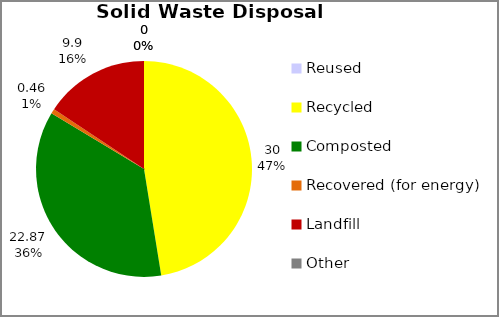
| Category | Series 0 |
|---|---|
| Reused | 0 |
| Recycled | 30 |
| Composted | 22.87 |
| Recovered (for energy) | 0.46 |
| Landfill | 9.9 |
| Other | 0 |